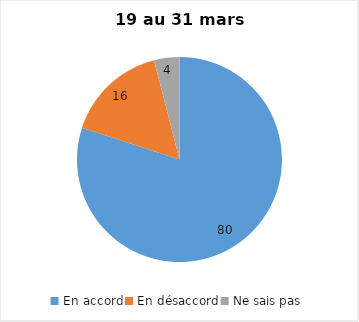
| Category | Series 0 |
|---|---|
| En accord | 80 |
| En désaccord | 16 |
| Ne sais pas | 4 |